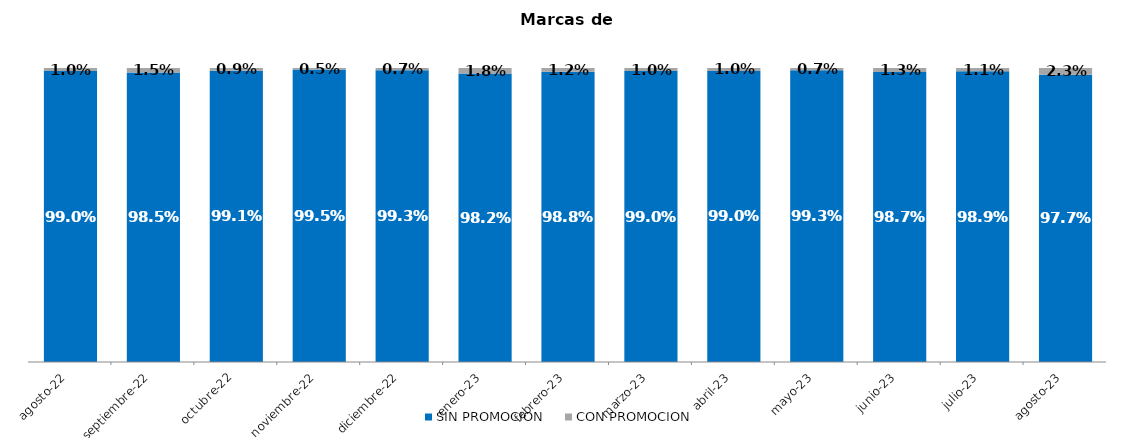
| Category | SIN PROMOCION   | CON PROMOCION   |
|---|---|---|
| 2022-08-01 | 0.99 | 0.01 |
| 2022-09-01 | 0.985 | 0.015 |
| 2022-10-01 | 0.991 | 0.009 |
| 2022-11-01 | 0.995 | 0.005 |
| 2022-12-01 | 0.993 | 0.007 |
| 2023-01-01 | 0.982 | 0.018 |
| 2023-02-01 | 0.988 | 0.012 |
| 2023-03-01 | 0.99 | 0.01 |
| 2023-04-01 | 0.99 | 0.01 |
| 2023-05-01 | 0.993 | 0.007 |
| 2023-06-01 | 0.987 | 0.013 |
| 2023-07-01 | 0.989 | 0.011 |
| 2023-08-01 | 0.977 | 0.023 |